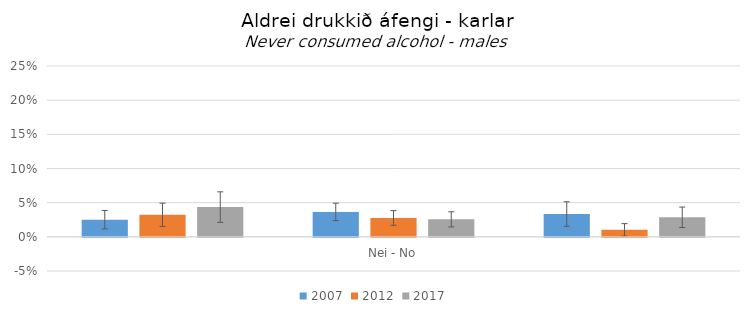
| Category | 2007 | 2012 | 2017 |
|---|---|---|---|
| 0 | 0.025 | 0.032 | 0.044 |
| 1 | 0.036 | 0.028 | 0.026 |
| 2 | 0.033 | 0.01 | 0.029 |